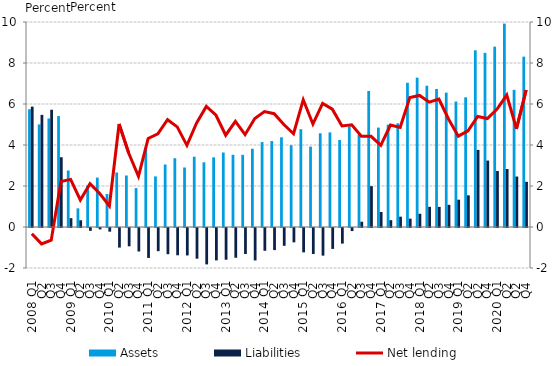
| Category | Assets | Liabilities |
|---|---|---|
| 2008 Q1 | 5.745 | 5.872 |
| Q2 | 5.004 | 5.47 |
| Q3 | 5.295 | 5.72 |
| Q4 | 5.412 | 3.403 |
| 2009 Q1 | 2.758 | 0.431 |
| Q2 | 0.909 | 0.328 |
| Q3 | 2.023 | -0.137 |
| Q4 | 2.411 | -0.068 |
| 2010 Q1 | 1.606 | -0.179 |
| Q2 | 2.659 | -0.955 |
| Q3 | 2.512 | -0.892 |
| Q4 | 1.896 | -1.146 |
| 2011 Q1 | 3.789 | -1.461 |
| Q2 | 2.467 | -1.131 |
| Q3 | 3.049 | -1.278 |
| Q4 | 3.356 | -1.33 |
| 2012 Q1 | 2.903 | -1.338 |
| Q2 | 3.428 | -1.497 |
| Q3 | 3.155 | -1.775 |
| Q4 | 3.399 | -1.58 |
| 2013 Q1 | 3.635 | -1.547 |
| Q2 | 3.523 | -1.452 |
| Q3 | 3.518 | -1.269 |
| Q4 | 3.817 | -1.582 |
| 2014 Q1 | 4.142 | -1.111 |
| Q2 | 4.192 | -1.077 |
| Q3 | 4.377 | -0.869 |
| Q4 | 3.989 | -0.7 |
| 2015 Q1 | 4.77 | -1.189 |
| Q2 | 3.921 | -1.268 |
| Q3 | 4.572 | -1.348 |
| Q4 | 4.616 | -1.02 |
| 2016 Q1 | 4.242 | -0.761 |
| Q2 | 4.914 | -0.15 |
| Q3 | 4.489 | 0.257 |
| Q4 | 6.636 | 1.993 |
| 2017 Q1 | 4.849 | 0.732 |
| Q2 | 4.994 | 0.333 |
| Q3 | 5.057 | 0.504 |
| Q4 | 7.036 | 0.408 |
| 2018 Q1 | 7.284 | 0.647 |
| Q2 | 6.891 | 0.985 |
| Q3 | 6.734 | 0.98 |
| Q4 | 6.555 | 1.082 |
| 2019 Q1 | 6.121 | 1.332 |
| Q2 | 6.326 | 1.545 |
| Q2 | 8.62 | 3.762 |
| Q4 | 8.495 | 3.241 |
| 2020 Q1 | 8.797 | 2.731 |
| Q2 | 9.922 | 2.83 |
| Q2 | 6.69 | 2.462 |
| Q4 | 8.309 | 2.205 |